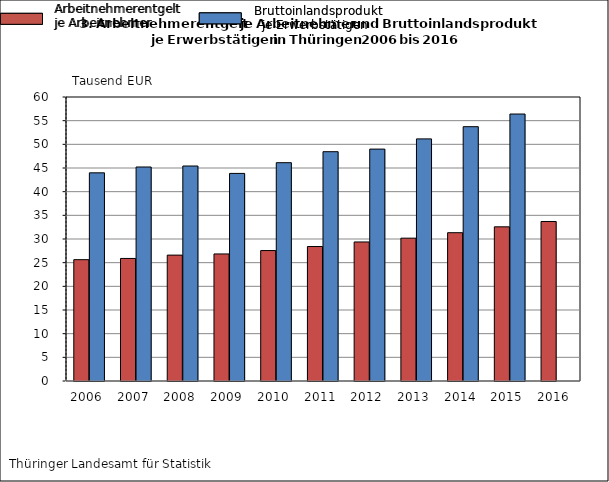
| Category | Arbeitnehmer-
entgelt je Arbeitnehmer | Bruttoinlands-
produkt je Erwerbstätigen |
|---|---|---|
| 2006.0 | 25.635 | 43.979 |
| 2007.0 | 25.893 | 45.212 |
| 2008.0 | 26.596 | 45.422 |
| 2009.0 | 26.843 | 43.857 |
| 2010.0 | 27.56 | 46.124 |
| 2011.0 | 28.409 | 48.445 |
| 2012.0 | 29.373 | 48.993 |
| 2013.0 | 30.175 | 51.152 |
| 2014.0 | 31.331 | 53.729 |
| 2015.0 | 32.569 | 56.403 |
| 2016.0 | 33.7 | 0 |